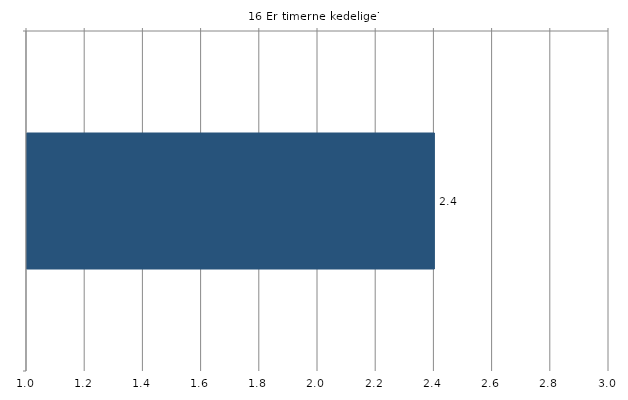
| Category | Gns. |
|---|---|
|   | 2.4 |